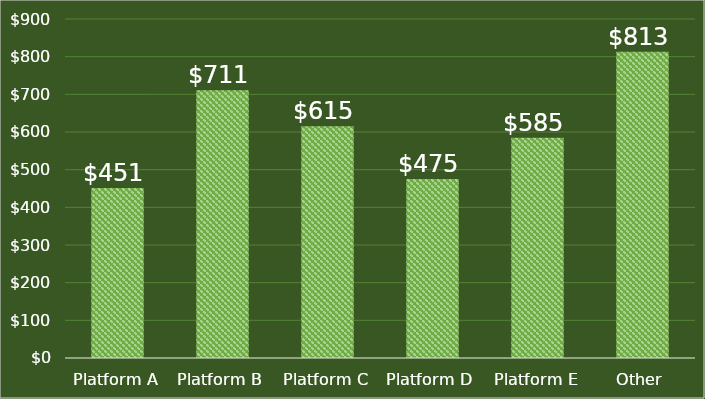
| Category | Cost per Acquisition |
|---|---|
| Platform A | 451 |
| Platform B | 711 |
| Platform C | 615 |
| Platform D | 475 |
| Platform E | 585 |
| Other | 813 |